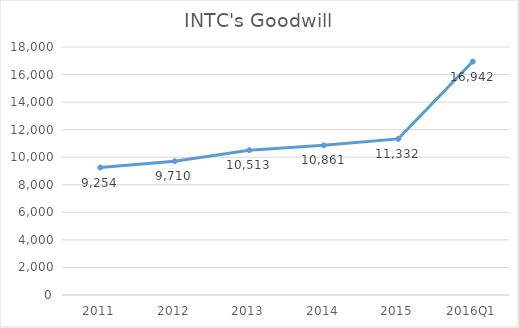
| Category | Series 0 |
|---|---|
| 2011 | 9254 |
| 2012 | 9710 |
| 2013 | 10513 |
| 2014 | 10861 |
| 2015 | 11332 |
| 2016Q1 | 16942 |